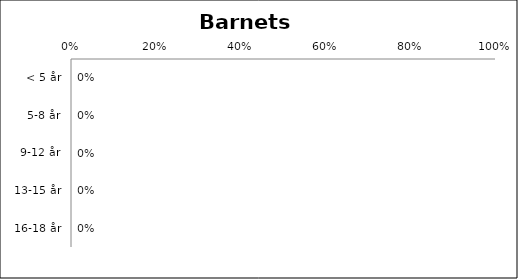
| Category | Barnets alder |
|---|---|
| < 5 år | 0 |
| 5-8 år | 0 |
| 9-12 år | 0 |
| 13-15 år | 0 |
| 16-18 år | 0 |